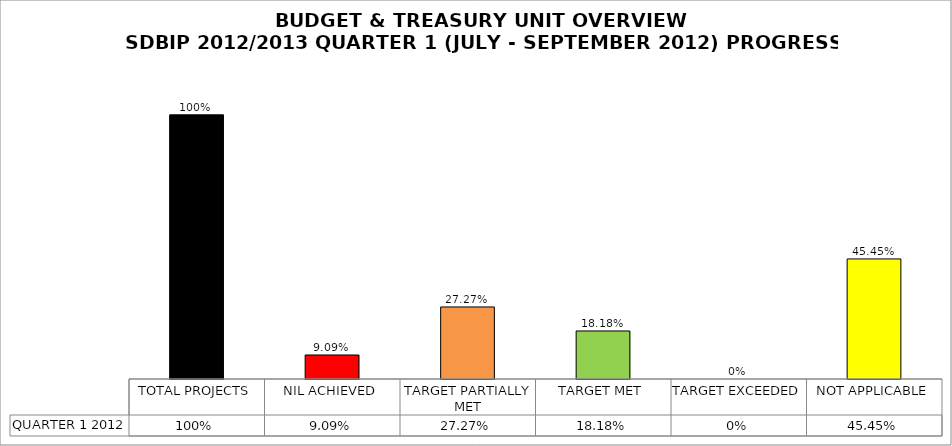
| Category | QUARTER 1 2012 |
|---|---|
| TOTAL PROJECTS | 1 |
| NIL ACHIEVED | 0.091 |
| TARGET PARTIALLY MET | 0.273 |
| TARGET MET | 0.182 |
| TARGET EXCEEDED | 0 |
| NOT APPLICABLE | 0.454 |